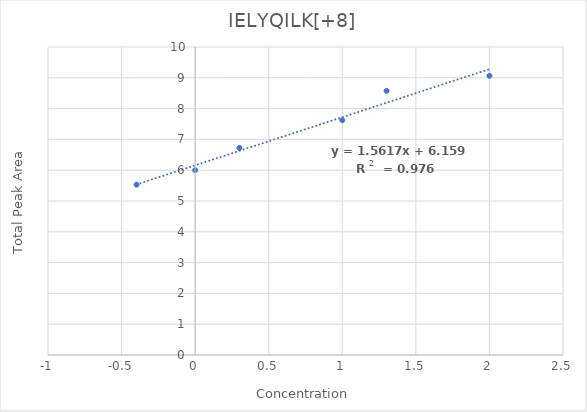
| Category | IELYQILK[+8] |
|---|---|
| -0.3979400086720376 | 5.53 |
| 0.0 | 6.002 |
| 0.3010299956639812 | 6.724 |
| 1.0 | 7.622 |
| 1.3010299956639813 | 8.577 |
| 2.0 | 9.065 |